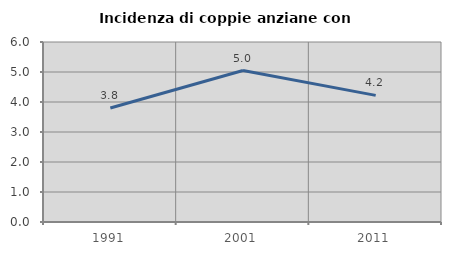
| Category | Incidenza di coppie anziane con figli |
|---|---|
| 1991.0 | 3.802 |
| 2001.0 | 5.049 |
| 2011.0 | 4.22 |